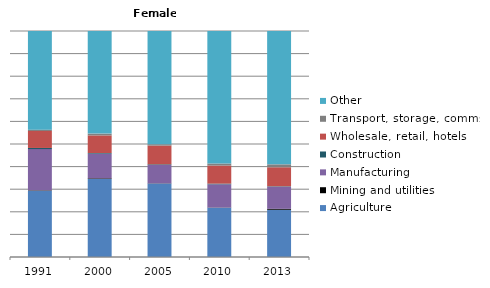
| Category | Agriculture | Mining and utilities | Manufacturing | Construction | Wholesale, retail, hotels | Transport, storage, comms | Other |
|---|---|---|---|---|---|---|---|
| 1991.0 | 29.3 | 0.2 | 18.2 | 0.5 | 7.5 | 0.6 | 43.6 |
| 2000.0 | 34.5 | 0.3 | 10.9 | 0.3 | 7.8 | 0.8 | 45.4 |
| 2005.0 | 32.5 | 0.1 | 8.1 | 0.3 | 8.3 | 0.6 | 50.1 |
| 2010.0 | 21.8 | 0.1 | 10.3 | 0.3 | 8 | 0.9 | 58.7 |
| 2013.0 | 20.9 | 0.4 | 9.8 | 0.2 | 8.4 | 1.3 | 59 |